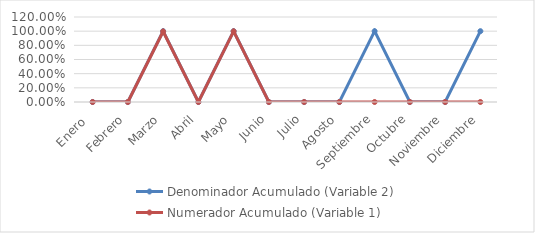
| Category | Denominador Acumulado (Variable 2) | Numerador Acumulado (Variable 1) |
|---|---|---|
| Enero  | 0 | 0 |
| Febrero | 0 | 0 |
| Marzo | 1 | 0.996 |
| Abril | 0 | 0 |
| Mayo | 1 | 0.998 |
| Junio | 0 | 0 |
| Julio | 0 | 0 |
| Agosto | 0 | 0 |
| Septiembre | 1 | 0 |
| Octubre | 0 | 0 |
| Noviembre | 0 | 0 |
| Diciembre | 1 | 0 |